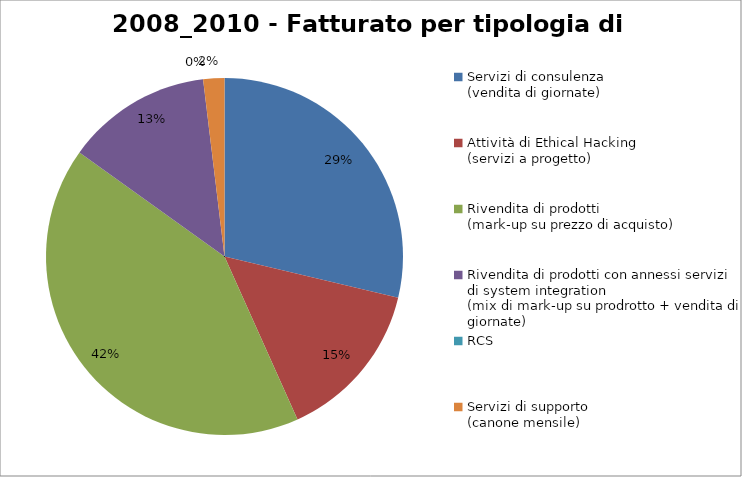
| Category | Tipologia di Servizi |
|---|---|
| Servizi di consulenza
(vendita di giornate) | 0.287 |
| Attività di Ethical Hacking
(servizi a progetto) | 0.146 |
| Rivendita di prodotti 
(mark-up su prezzo di acquisto) | 0.416 |
| Rivendita di prodotti con annessi servizi di system integration
(mix di mark-up su prodrotto + vendita di giornate) | 0.132 |
| RCS | 0 |
| Servizi di supporto
(canone mensile) | 0.019 |